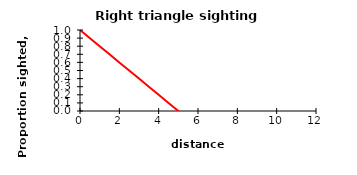
| Category | g(y) |
|---|---|
| 0.0 | 1 |
| 1.0 | 0.8 |
| 2.0 | 0.6 |
| 3.0 | 0.4 |
| 4.0 | 0.2 |
| 5.0 | 0 |
| 6.0 | -0.2 |
| 7.0 | -0.4 |
| 8.0 | -0.6 |
| 9.0 | -0.8 |
| 10.0 | -1 |